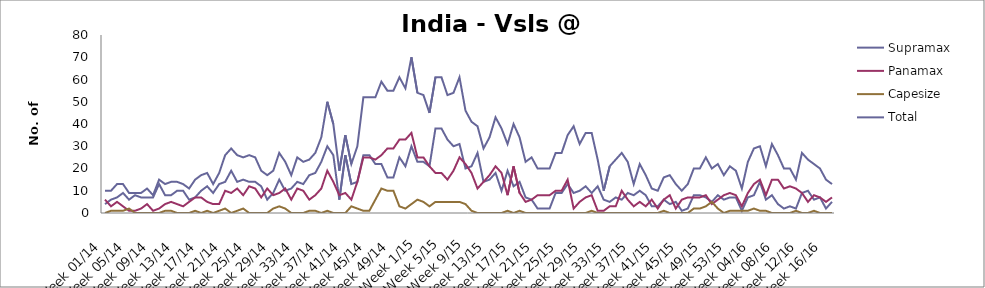
| Category | Supramax | Panamax | Capesize | Total |
|---|---|---|---|---|
| Week 01/14 | 4 | 6 | 0 | 10 |
| Week 02/14 | 6 | 3 | 1 | 10 |
| Week 03/14 | 7 | 5 | 1 | 13 |
| Week 04/14 | 9 | 3 | 1 | 13 |
| Week 05/14 | 6 | 1 | 2 | 9 |
| Week 06/14 | 8 | 1 | 0 | 9 |
| Week 07/14 | 7 | 2 | 0 | 9 |
| Week 08/14 | 7 | 4 | 0 | 11 |
| Week 09/14 | 7 | 1 | 0 | 8 |
| Week 10/14 | 13 | 2 | 0 | 15 |
| Week 11/14 | 8 | 4 | 1 | 13 |
| Week 12/14 | 8 | 5 | 1 | 14 |
| Week 13/14 | 10 | 4 | 0 | 14 |
| Week 14/14 | 10 | 3 | 0 | 13 |
| Week 15/14 | 6 | 5 | 0 | 11 |
| Week 16/14 | 7 | 7 | 1 | 15 |
| Week 17/14 | 10 | 7 | 0 | 17 |
| Week 18/14 | 12 | 5 | 1 | 18 |
| Week 19/14 | 9 | 4 | 0 | 13 |
| Week 20/14 | 13 | 4 | 1 | 18 |
| Week 21/14 | 14 | 10 | 2 | 26 |
| Week 22/14 | 19 | 9 | 0 | 29 |
| Week 23/14 | 14 | 11 | 1 | 26 |
| Week 24/14 | 15 | 8 | 2 | 25 |
| Week 25/14 | 14 | 12 | 0 | 26 |
| Week 26/14 | 14 | 11 | 0 | 25 |
| Week 27/14 | 12 | 7 | 0 | 19 |
| Week 28/14 | 6 | 11 | 0 | 17 |
| Week 29/14 | 9 | 8 | 2 | 19 |
| Week 30/14 | 15 | 9 | 3 | 27 |
| Week 31/14 | 10 | 11 | 2 | 23 |
| Week 32/14 | 11 | 6 | 0 | 17 |
| Week 33/14 | 14 | 11 | 0 | 25 |
| Week 34/14 | 13 | 10 | 0 | 23 |
| Week 35/14 | 17 | 6 | 1 | 24 |
| Week 36/14 | 18 | 8 | 1 | 27 |
| Week 37/14 | 23 | 11 | 0 | 34 |
| Week 38/14 | 30 | 19 | 1 | 50 |
| Week 39/14 | 26 | 14 | 0 | 40 |
| Week 40/14 | 6 | 8 | 0 | 19 |
| Week 41/14 | 26 | 9 | 0 | 35 |
| Week 42/14 | 13 | 6 | 3 | 22 |
| Week 43/14 | 14 | 14 | 2 | 30 |
| Week 44/14 | 26 | 25 | 1 | 52 |
| Week 45/14 | 26 | 25 | 1 | 52 |
| Week 46/14 | 22 | 24 | 6 | 52 |
| Week 47/14 | 22 | 26 | 11 | 59 |
| Week 48/14 | 16 | 29 | 10 | 55 |
| Week 49/14 | 16 | 29 | 10 | 55 |
| Week 50/14 | 25 | 33 | 3 | 61 |
| Week 51/14 | 21 | 33 | 2 | 56 |
| Week 52/14 | 30 | 36 | 4 | 70 |
| Week 1/15 | 23 | 25 | 6 | 54 |
| Week 2/15 | 23 | 25 | 5 | 53 |
| Week 3/15 | 21 | 21 | 3 | 45 |
| Week 4/15 | 38 | 18 | 5 | 61 |
| Week 5/15 | 38 | 18 | 5 | 61 |
| Week 6/15 | 33 | 15 | 5 | 53 |
| Week 7/15 | 30 | 19 | 5 | 54 |
| Week 8/15 | 31 | 25 | 5 | 61 |
| Week 9/15 | 20 | 22 | 4 | 46 |
| Week 10/15 | 21 | 18 | 1 | 41 |
| Week 11/15 | 27 | 11 | 0 | 39 |
| Week 12/15 | 14 | 14 | 0 | 29 |
| Week 13/15 | 15 | 17 | 0 | 34 |
| Week 14/15 | 18 | 21 | 0 | 43 |
| Week 15/15 | 10 | 18 | 0 | 38 |
| Week 16/15 | 19 | 8 | 1 | 31 |
| Week 17/15 | 12 | 21 | 0 | 40 |
| Week 18/15 | 14 | 9 | 1 | 34 |
| Week 19/15 | 7 | 5 | 0 | 23 |
| Week 20/15 | 6 | 6 | 0 | 25 |
| Week 21/15 | 2 | 8 | 0 | 20 |
| Week 22/15 | 2 | 8 | 0 | 20 |
| Week 23/15 | 2 | 8 | 0 | 20 |
| Week 24/15 | 9 | 10 | 0 | 27 |
| Week 25/15 | 9 | 10 | 0 | 27 |
| Week 26/15 | 13 | 15 | 0 | 35 |
| Week 27/15 | 9 | 2 | 0 | 39 |
| Week 28/15 | 10 | 5 | 0 | 31 |
| Week 29/15 | 12 | 7 | 0 | 36 |
| Week 30/15 | 9 | 8 | 1 | 36 |
| Week 31/15 | 12 | 1 | 0 | 24 |
| Week 32/15 | 6 | 1 | 0 | 10 |
| Week 33/15 | 5 | 3 | 0 | 21 |
| Week 34/15 | 7 | 3 | 0 | 24 |
| Week 35/15 | 6 | 10 | 0 | 27 |
| Week 36/15 | 9 | 6 | 0 | 23 |
| Week 37/15 | 8 | 3 | 0 | 13 |
| Week 38/15 | 10 | 5 | 0 | 22 |
| Week 39/15 | 8 | 3 | 0 | 17 |
| Week 40/15 | 3 | 6 | 0 | 11 |
| Week 41/15 | 3 | 2 | 0 | 10 |
| Week 42/15 | 6 | 6 | 1 | 16 |
| Week 43/15 | 4 | 8 | 0 | 17 |
| Week 44/15 | 5 | 2 | 0 | 13 |
| Week 45/15 | 1 | 6 | 0 | 10 |
| Week 46/15 | 2 | 7 | 0 | 13 |
| Week 47/15 | 8 | 7 | 2 | 20 |
| Week 48/15 | 8 | 7 | 2 | 20 |
| Week 49/15 | 7 | 8 | 3 | 25 |
| Week 50/15 | 5 | 4 | 5 | 20 |
| Week 51/15 | 8 | 6 | 2 | 22 |
| Week 52/15 | 6 | 8 | 0 | 17 |
| Week 53/15 | 7 | 9 | 1 | 21 |
| Week 01/16 | 7 | 8 | 1 | 19 |
| Week 02/16 | 1 | 3 | 1 | 11 |
| Week 03/16 | 7 | 9 | 1 | 23 |
| Week 04/16 | 8 | 13 | 2 | 29 |
| Week 05/16 | 14 | 15 | 1 | 30 |
| Week 06/16 | 6 | 8 | 1 | 21 |
| Week 07/16 | 8 | 15 | 0 | 31 |
| Week 08/16 | 4 | 15 | 0 | 26 |
| Week 09/16 | 2 | 11 | 0 | 20 |
| Week 10/16 | 3 | 12 | 0 | 20 |
| Week 11/16 | 2 | 11 | 1 | 15 |
| Week 12/16 | 9 | 9 | 0 | 27 |
| Week 13/16 | 10 | 5 | 0 | 24 |
| Week 14/16 | 6 | 8 | 1 | 22 |
| Week 15/16 | 7 | 7 | 0 | 20 |
| Week 16/16 | 2 | 5 | 0 | 15 |
| Week 17/16 | 5 | 7 | 0 | 13 |